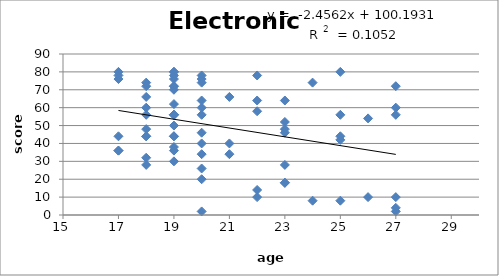
| Category | Series 0 |
|---|---|
| 17.0 | 80 |
| 17.0 | 78 |
| 17.0 | 36 |
| 17.0 | 36 |
| 17.0 | 44 |
| 17.0 | 76 |
| 18.0 | 32 |
| 18.0 | 60 |
| 18.0 | 72 |
| 18.0 | 66 |
| 18.0 | 56 |
| 18.0 | 44 |
| 18.0 | 74 |
| 18.0 | 28 |
| 18.0 | 44 |
| 18.0 | 48 |
| 19.0 | 44 |
| 19.0 | 78 |
| 19.0 | 44 |
| 19.0 | 36 |
| 19.0 | 80 |
| 19.0 | 70 |
| 19.0 | 80 |
| 19.0 | 50 |
| 19.0 | 38 |
| 19.0 | 76 |
| 19.0 | 72 |
| 19.0 | 56 |
| 19.0 | 62 |
| 19.0 | 56 |
| 19.0 | 72 |
| 19.0 | 56 |
| 19.0 | 30 |
| 20.0 | 74 |
| 20.0 | 26 |
| 20.0 | 56 |
| 20.0 | 78 |
| 20.0 | 76 |
| 20.0 | 60 |
| 20.0 | 34 |
| 20.0 | 20 |
| 20.0 | 46 |
| 20.0 | 64 |
| 20.0 | 2 |
| 20.0 | 40 |
| 21.0 | 40 |
| 21.0 | 34 |
| 21.0 | 66 |
| 22.0 | 78 |
| 22.0 | 58 |
| 22.0 | 10 |
| 22.0 | 14 |
| 22.0 | 64 |
| 23.0 | 48 |
| 23.0 | 18 |
| 23.0 | 64 |
| 23.0 | 28 |
| 23.0 | 46 |
| 23.0 | 18 |
| 23.0 | 52 |
| 24.0 | 8 |
| 24.0 | 74 |
| 25.0 | 42 |
| 25.0 | 56 |
| 25.0 | 80 |
| 25.0 | 8 |
| 25.0 | 44 |
| 26.0 | 10 |
| 26.0 | 54 |
| 27.0 | 60 |
| 27.0 | 56 |
| 27.0 | 10 |
| 27.0 | 4 |
| 27.0 | 72 |
| 27.0 | 2 |